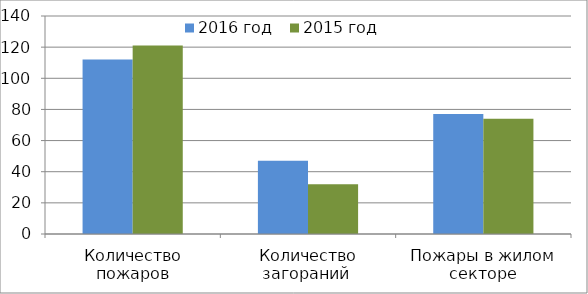
| Category | 2016 год | 2015 год |
|---|---|---|
| Количество пожаров | 112 | 121 |
| Количество загораний  | 47 | 32 |
| Пожары в жилом секторе | 77 | 74 |